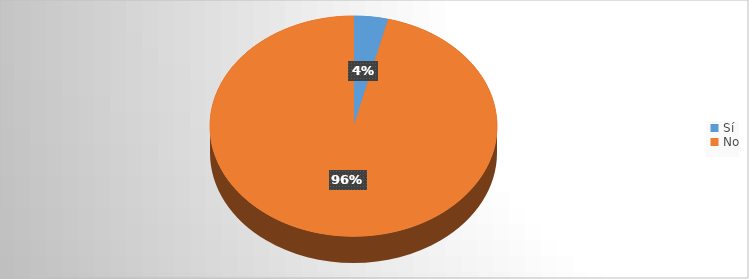
| Category | Series 0 |
|---|---|
| Sí | 7 |
| No | 174 |